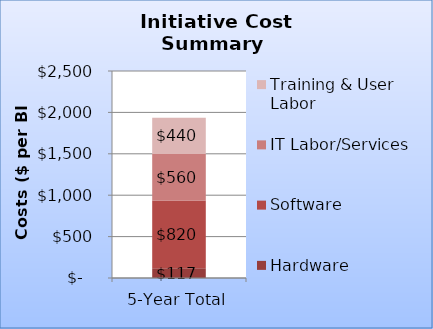
| Category | Hardware | Software | IT Labor/Services | Training & User Labor |
|---|---|---|---|---|
| 5-Year Total | 116.919 | 820.017 | 559.649 | 439.991 |